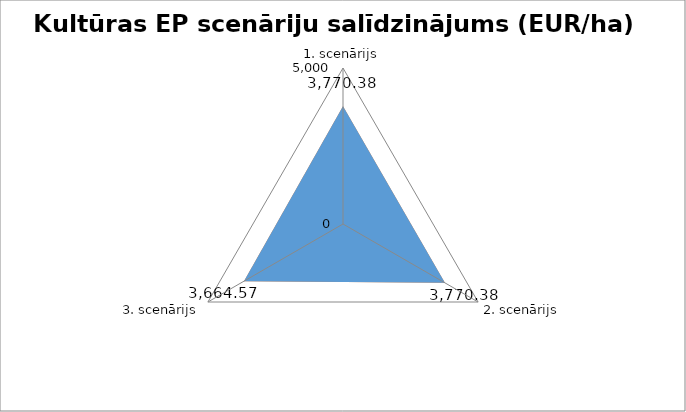
| Category | Series 1 | Series 0 |
|---|---|---|
| 1. scenārijs | 3770.381 | 3770.381 |
| 2. scenārijs | 3770.381 | 3770.381 |
| 3. scenārijs | 3664.572 | 3664.572 |